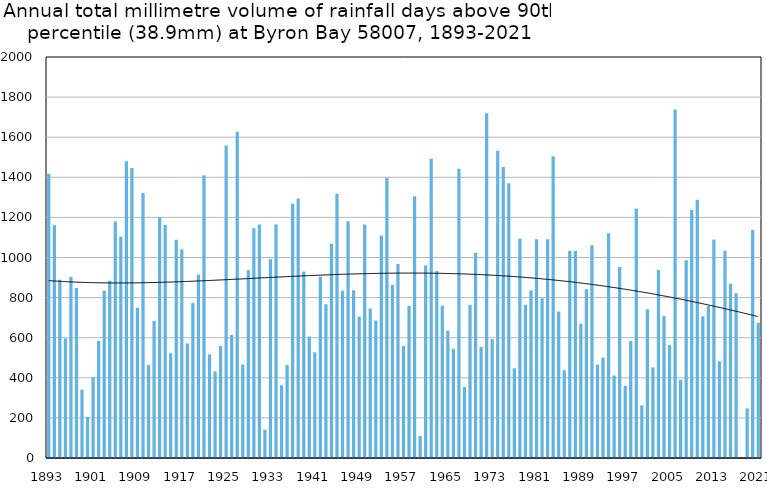
| Category | Annual total mm in days above 90th percentile |
|---|---|
| 1893 | 1418.1 |
| 1894 | 1161.7 |
| 1895 | 889.3 |
| 1896 | 597.1 |
| 1897 | 903.3 |
| 1898 | 847.9 |
| 1899 | 340.5 |
| 1900 | 205.2 |
| 1901 | 403.4 |
| 1902 | 584.1 |
| 1903 | 835.2 |
| 1904 | 883.9 |
| 1905 | 1179.5 |
| 1906 | 1104.4 |
| 1907 | 1480.1 |
| 1908 | 1446.4 |
| 1909 | 749.2 |
| 1910 | 1321.9 |
| 1911 | 464.2 |
| 1912 | 683.3 |
| 1913 | 1200.7 |
| 1914 | 1162.4 |
| 1915 | 522.5 |
| 1916 | 1088.5 |
| 1917 | 1040.7 |
| 1918 | 571.4 |
| 1919 | 772.7 |
| 1920 | 914 |
| 1921 | 1410 |
| 1922 | 517 |
| 1923 | 431.9 |
| 1924 | 558.3 |
| 1925 | 1559 |
| 1926 | 613.6 |
| 1927 | 1627.7 |
| 1928 | 466.6 |
| 1929 | 936.6 |
| 1930 | 1146.2 |
| 1931 | 1165.1 |
| 1932 | 141.5 |
| 1933 | 991.5 |
| 1934 | 1164.6 |
| 1935 | 362.7 |
| 1936 | 463.6 |
| 1937 | 1268.2 |
| 1938 | 1294.1 |
| 1939 | 929.8 |
| 1940 | 606.1 |
| 1941 | 527 |
| 1942 | 904.1 |
| 1943 | 767.2 |
| 1944 | 1069.2 |
| 1945 | 1317.5 |
| 1946 | 834.1 |
| 1947 | 1180.3 |
| 1948 | 837.2 |
| 1949 | 705.5 |
| 1950 | 1164.7 |
| 1951 | 745.5 |
| 1952 | 685.7 |
| 1953 | 1109.2 |
| 1954 | 1396.2 |
| 1955 | 862.5 |
| 1956 | 968.3 |
| 1957 | 558.3 |
| 1958 | 759 |
| 1959 | 1304.9 |
| 1960 | 110 |
| 1961 | 960.5 |
| 1962 | 1492.7 |
| 1963 | 932.5 |
| 1964 | 759.5 |
| 1965 | 635.4 |
| 1966 | 544.6 |
| 1967 | 1443.2 |
| 1968 | 354.7 |
| 1969 | 763.8 |
| 1970 | 1022.4 |
| 1971 | 553.5 |
| 1972 | 1719.3 |
| 1973 | 593.1 |
| 1974 | 1533 |
| 1975 | 1451 |
| 1976 | 1370 |
| 1977 | 447.8 |
| 1978 | 1093.9 |
| 1979 | 763.6 |
| 1980 | 836.4 |
| 1981 | 1091.3 |
| 1982 | 796.4 |
| 1983 | 1090.9 |
| 1984 | 1505.3 |
| 1985 | 730.3 |
| 1986 | 437.8 |
| 1987 | 1033.4 |
| 1988 | 1032.9 |
| 1989 | 670.3 |
| 1990 | 841.5 |
| 1991 | 1060.7 |
| 1992 | 465.6 |
| 1993 | 500.4 |
| 1994 | 1120.5 |
| 1995 | 411.3 |
| 1996 | 953.2 |
| 1997 | 360.4 |
| 1998 | 583.2 |
| 1999 | 1243.8 |
| 2000 | 262.6 |
| 2001 | 741.4 |
| 2002 | 451.8 |
| 2003 | 937.4 |
| 2004 | 708.4 |
| 2005 | 563.2 |
| 2006 | 1737.6 |
| 2007 | 390.6 |
| 2008 | 986.4 |
| 2009 | 1236.8 |
| 2010 | 1288.6 |
| 2011 | 707.2 |
| 2012 | 758.4 |
| 2013 | 1089.4 |
| 2014 | 482.6 |
| 2015 | 1033.7 |
| 2016 | 868.8 |
| 2017 | 821.6 |
| 2018 | 0 |
| 2019 | 247.4 |
| 2020 | 1137.4 |
| 2021 | 673.8 |